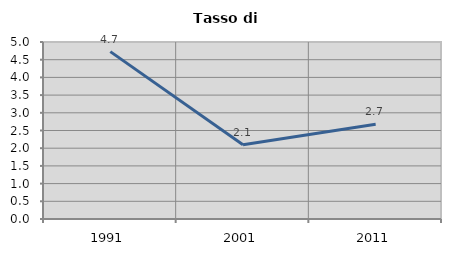
| Category | Tasso di disoccupazione   |
|---|---|
| 1991.0 | 4.728 |
| 2001.0 | 2.098 |
| 2011.0 | 2.679 |